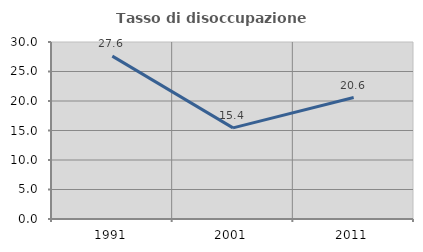
| Category | Tasso di disoccupazione giovanile  |
|---|---|
| 1991.0 | 27.6 |
| 2001.0 | 15.439 |
| 2011.0 | 20.583 |